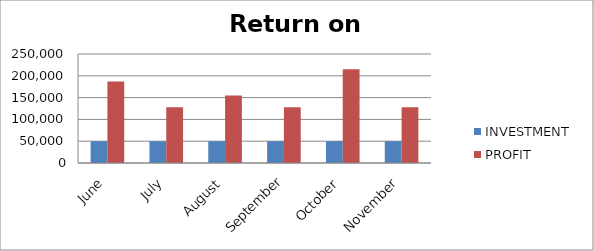
| Category | INVESTMENT  | PROFIT |
|---|---|---|
| June | 50000 | 187101 |
| July | 50000 | 127679 |
| August | 50000 | 154994 |
| September | 50000 | 127951 |
| October | 50000 | 214845 |
| November | 50000 | 128050 |